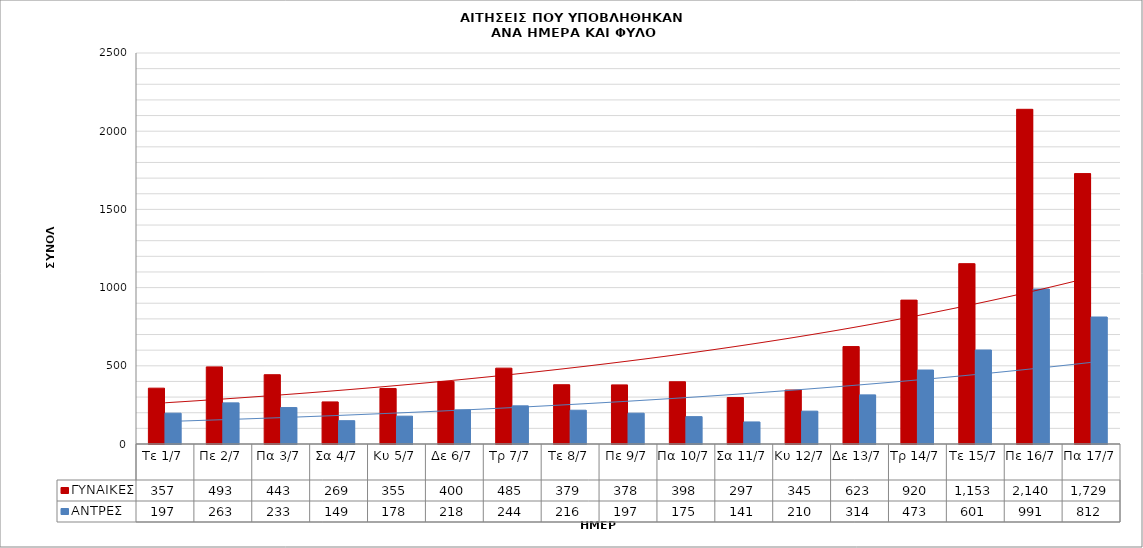
| Category | ΓΥΝΑΙΚΕΣ | ΑΝΤΡΕΣ |
|---|---|---|
| Τε 1/7 | 357 | 197 |
| Πε 2/7 | 493 | 263 |
| Πα 3/7 | 443 | 233 |
| Σα 4/7 | 269 | 149 |
| Κυ 5/7 | 355 | 178 |
| Δε 6/7 | 400 | 218 |
| Τρ 7/7 | 485 | 244 |
| Τε 8/7 | 379 | 216 |
| Πε 9/7 | 378 | 197 |
| Πα 10/7 | 398 | 175 |
| Σα 11/7 | 297 | 141 |
| Κυ 12/7 | 345 | 210 |
| Δε 13/7 | 623 | 314 |
| Τρ 14/7 | 920 | 473 |
| Τε 15/7 | 1153 | 601 |
| Πε 16/7 | 2140 | 991 |
| Πα 17/7 | 1729 | 812 |